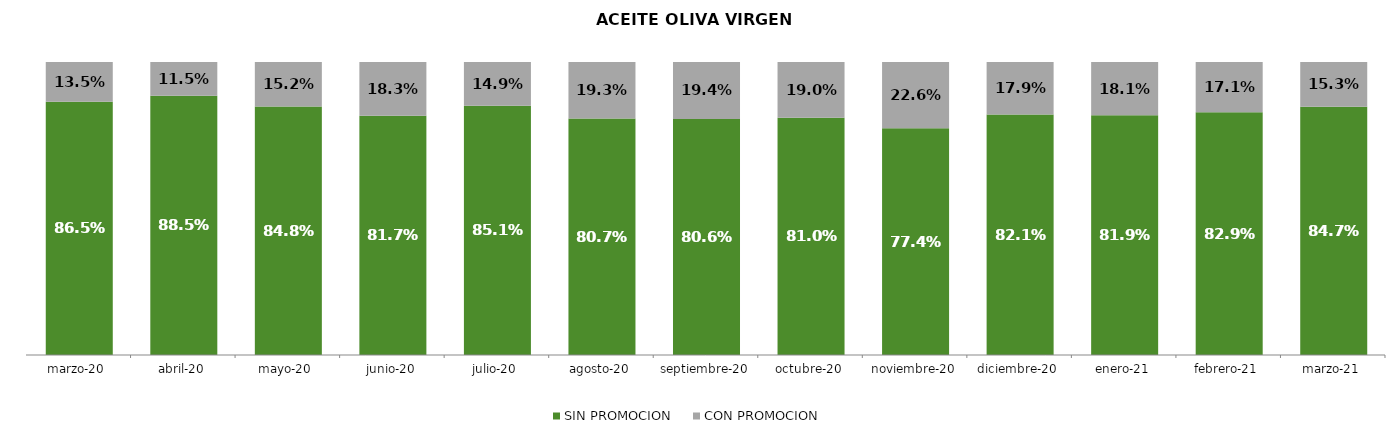
| Category | SIN PROMOCION   | CON PROMOCION   |
|---|---|---|
| 2020-03-01 | 0.865 | 0.135 |
| 2020-04-01 | 0.885 | 0.115 |
| 2020-05-01 | 0.848 | 0.152 |
| 2020-06-01 | 0.817 | 0.183 |
| 2020-07-01 | 0.851 | 0.149 |
| 2020-08-01 | 0.807 | 0.193 |
| 2020-09-01 | 0.806 | 0.194 |
| 2020-10-01 | 0.81 | 0.19 |
| 2020-11-01 | 0.774 | 0.226 |
| 2020-12-01 | 0.821 | 0.179 |
| 2021-01-01 | 0.819 | 0.181 |
| 2021-02-01 | 0.829 | 0.171 |
| 2021-03-01 | 0.847 | 0.153 |